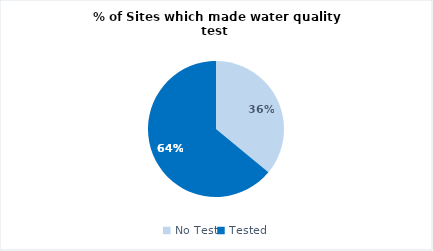
| Category | Rakhine |
|---|---|
| No Test | 9 |
| Tested | 16 |